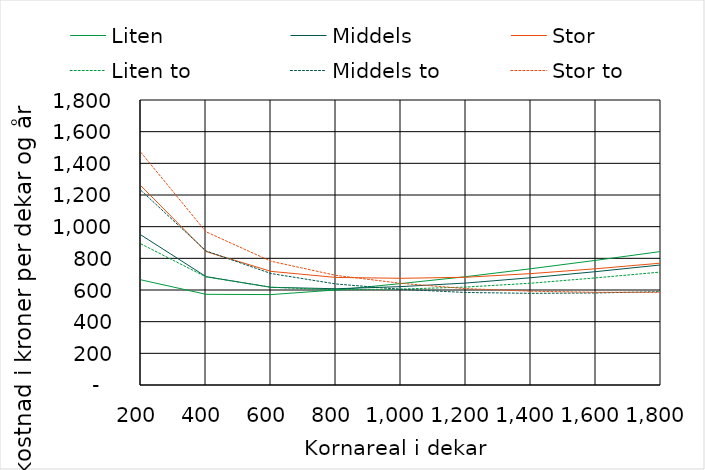
| Category | Liten | Middels | Stor | Liten to | Middels to | Stor to |
|---|---|---|---|---|---|---|
| 200.0 | 664.11 | 947.322 | 1257.606 | 890.963 | 1228.738 | 1468.195 |
| 400.0 | 572.675 | 684.616 | 842.711 | 682.57 | 846.725 | 967.698 |
| 600.0 | 571.071 | 616.861 | 717.659 | 617.504 | 704.092 | 781.633 |
| 800.0 | 600.376 | 607.941 | 679.357 | 601.348 | 638.028 | 692.194 |
| 1000.0 | 640.682 | 621.402 | 673.889 | 605.8 | 604.219 | 642.216 |
| 1200.0 | 684.18 | 643.917 | 680.555 | 618.652 | 584.234 | 608.493 |
| 1400.0 | 734.311 | 677.578 | 703.58 | 642.913 | 578.892 | 592.432 |
| 1600.0 | 787.537 | 716.142 | 734.27 | 676.791 | 581.332 | 585.45 |
| 1800.0 | 843.315 | 758.482 | 769.823 | 713.511 | 589.556 | 585.121 |